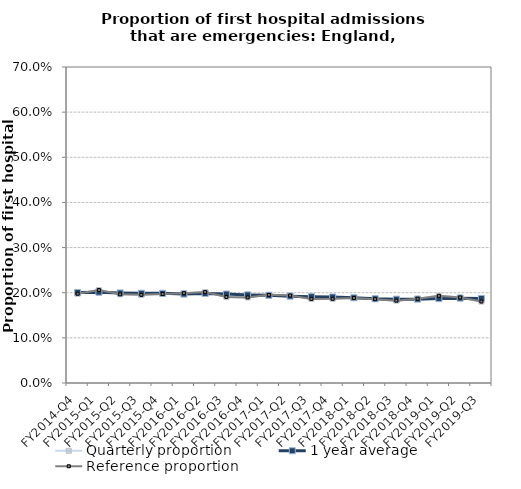
| Category | Quarterly proportion | 1 year average | Reference proportion |
|---|---|---|---|
| FY2014-Q4 | 0.198 | 0.201 | 0.198 |
| FY2015-Q1 | 0.206 | 0.201 | 0.206 |
| FY2015-Q2 | 0.196 | 0.199 | 0.196 |
| FY2015-Q3 | 0.195 | 0.199 | 0.195 |
| FY2015-Q4 | 0.197 | 0.199 | 0.197 |
| FY2016-Q1 | 0.199 | 0.197 | 0.199 |
| FY2016-Q2 | 0.201 | 0.198 | 0.201 |
| FY2016-Q3 | 0.191 | 0.197 | 0.191 |
| FY2016-Q4 | 0.19 | 0.195 | 0.19 |
| FY2017-Q1 | 0.195 | 0.194 | 0.195 |
| FY2017-Q2 | 0.194 | 0.192 | 0.194 |
| FY2017-Q3 | 0.186 | 0.191 | 0.186 |
| FY2017-Q4 | 0.186 | 0.191 | 0.186 |
| FY2018-Q1 | 0.188 | 0.189 | 0.188 |
| FY2018-Q2 | 0.186 | 0.187 | 0.186 |
| FY2018-Q3 | 0.182 | 0.186 | 0.182 |
| FY2018-Q4 | 0.187 | 0.186 | 0.187 |
| FY2019-Q1 | 0.193 | 0.187 | 0.193 |
| FY2019-Q2 | 0.19 | 0.188 | 0.19 |
| FY2019-Q3 | 0.18 | 0.187 | 0.18 |